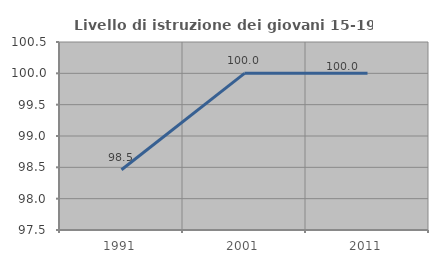
| Category | Livello di istruzione dei giovani 15-19 anni |
|---|---|
| 1991.0 | 98.462 |
| 2001.0 | 100 |
| 2011.0 | 100 |